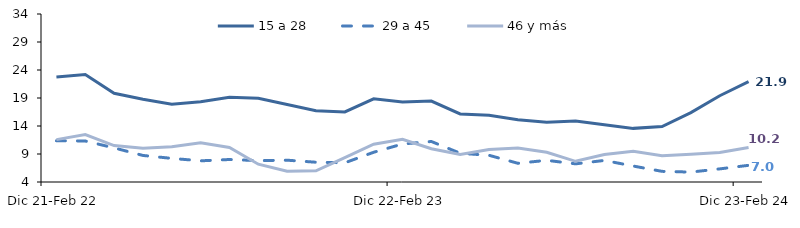
| Category | 15 a 28 | 29 a 45 | 46 y más |
|---|---|---|---|
| Dic 21-Feb 22 | 22.74 | 11.361 | 11.565 |
| Ene-Mar 2022 | 23.179 | 11.321 | 12.486 |
| Feb-Abr 2022 | 19.85 | 10.092 | 10.498 |
| Mar-May 2022 | 18.764 | 8.741 | 10.047 |
| Abr-Jun 2022 | 17.886 | 8.22 | 10.289 |
| May-Jul 2022 | 18.314 | 7.781 | 10.985 |
| Jun-Ago 2022 | 19.146 | 8.017 | 10.169 |
| Jul-Sep 2022 | 18.938 | 7.819 | 7.177 |
| Ago-Oct 2022 | 17.841 | 7.895 | 5.926 |
| Sep-Nov 2022 | 16.744 | 7.53 | 5.995 |
| Oct-Dic 2022 | 16.504 | 7.429 | 8.366 |
| Nov 22-Ene 23 | 18.862 | 9.309 | 10.742 |
| Dic 22-Feb 23 | 18.269 | 10.788 | 11.629 |
| Ene-Mar 2023 | 18.457 | 11.236 | 9.929 |
| Feb-Abr 2023 | 16.157 | 9.136 | 8.91 |
| Mar-May 2023 | 15.908 | 8.769 | 9.808 |
| Abr-Jun 2023 | 15.104 | 7.343 | 10.069 |
| May-Jul 2023 | 14.673 | 7.871 | 9.315 |
| Jun-Ago 2023 | 14.877 | 7.244 | 7.693 |
| Jul-Sep 2023 | 14.21 | 7.852 | 8.909 |
| Ago-Oct 2023 | 13.577 | 6.85 | 9.481 |
| Sep-Nov 2023 | 13.908 | 5.901 | 8.701 |
| Oct-Dic 2023 | 16.384 | 5.771 | 8.939 |
| Nov 23-Ene 24 | 19.401 | 6.342 | 9.275 |
| Dic 23-Feb 24 | 21.913 | 6.98 | 10.161 |